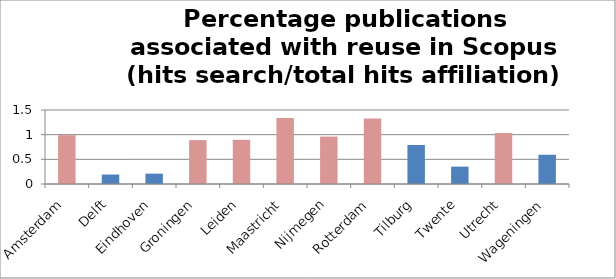
| Category | Percentage (hits search/total hits affiliation) |
|---|---|
| Amsterdam | 0.99 |
| Delft | 0.192 |
| Eindhoven | 0.21 |
| Groningen | 0.889 |
| Leiden | 0.895 |
| Maastricht | 1.338 |
| Nijmegen | 0.961 |
| Rotterdam | 1.327 |
| Tilburg | 0.791 |
| Twente | 0.352 |
| Utrecht | 1.032 |
| Wageningen | 0.593 |